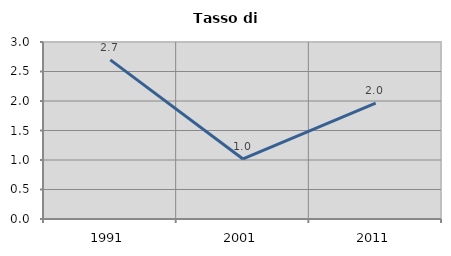
| Category | Tasso di disoccupazione   |
|---|---|
| 1991.0 | 2.697 |
| 2001.0 | 1.018 |
| 2011.0 | 1.965 |